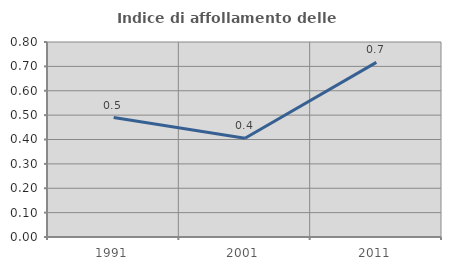
| Category | Indice di affollamento delle abitazioni  |
|---|---|
| 1991.0 | 0.49 |
| 2001.0 | 0.405 |
| 2011.0 | 0.716 |